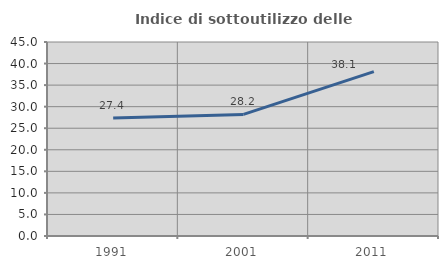
| Category | Indice di sottoutilizzo delle abitazioni  |
|---|---|
| 1991.0 | 27.358 |
| 2001.0 | 28.195 |
| 2011.0 | 38.144 |